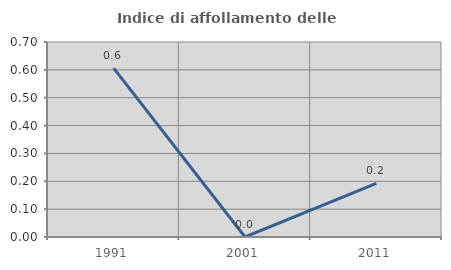
| Category | Indice di affollamento delle abitazioni  |
|---|---|
| 1991.0 | 0.606 |
| 2001.0 | 0 |
| 2011.0 | 0.192 |